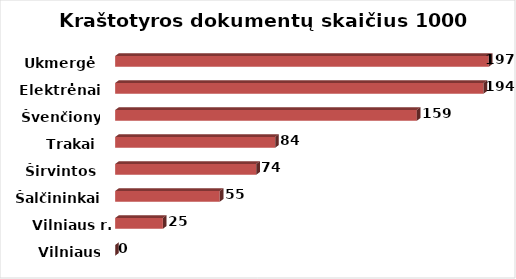
| Category | Series 0 |
|---|---|
| Vilniaus m. | 0 |
| Vilniaus r. | 25.149 |
| Šalčininkai | 55.064 |
| Širvintos | 74.313 |
| Trakai | 84.274 |
| Švenčionys | 158.894 |
| Elektrėnai | 194.002 |
| Ukmergė | 196.781 |